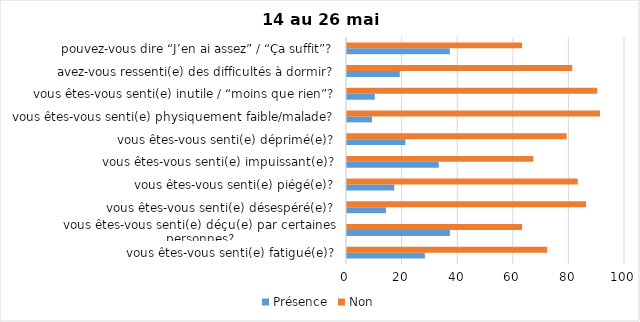
| Category | Présence | Non |
|---|---|---|
| vous êtes-vous senti(e) fatigué(e)? | 28 | 72 |
| vous êtes-vous senti(e) déçu(e) par certaines personnes? | 37 | 63 |
| vous êtes-vous senti(e) désespéré(e)? | 14 | 86 |
| vous êtes-vous senti(e) piégé(e)? | 17 | 83 |
| vous êtes-vous senti(e) impuissant(e)? | 33 | 67 |
| vous êtes-vous senti(e) déprimé(e)? | 21 | 79 |
| vous êtes-vous senti(e) physiquement faible/malade? | 9 | 91 |
| vous êtes-vous senti(e) inutile / “moins que rien”? | 10 | 90 |
| avez-vous ressenti(e) des difficultés à dormir? | 19 | 81 |
| pouvez-vous dire “J’en ai assez” / “Ça suffit”? | 37 | 63 |